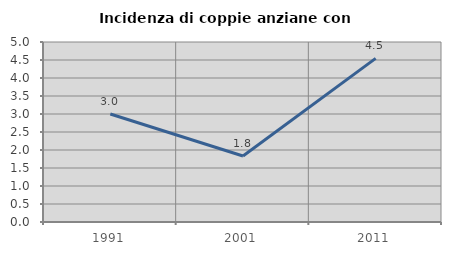
| Category | Incidenza di coppie anziane con figli |
|---|---|
| 1991.0 | 3 |
| 2001.0 | 1.835 |
| 2011.0 | 4.545 |